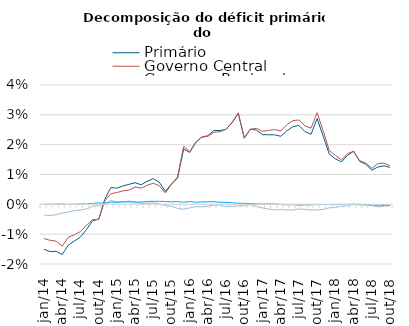
| Category | Primário | Governo Central | Governos Regionais | Empresas Estatais* |
|---|---|---|---|---|
| jan/14 | -0.015 | -0.011 | -0.004 | 0 |
| fev/14 | -0.016 | -0.012 | -0.004 | 0 |
| mar/14 | -0.016 | -0.012 | -0.003 | 0 |
| abr/14 | -0.017 | -0.014 | -0.003 | 0 |
| mai/14 | -0.014 | -0.011 | -0.003 | 0 |
| jun/14 | -0.012 | -0.01 | -0.002 | 0 |
| jul/14 | -0.011 | -0.009 | -0.002 | 0 |
| ago/14 | -0.008 | -0.007 | -0.002 | 0 |
| set/14 | -0.005 | -0.005 | -0.001 | 0 |
| out/14 | -0.005 | -0.005 | 0 | 0 |
| nov/14 | 0.002 | 0.001 | 0 | 0 |
| dez/14 | 0.006 | 0.004 | 0.001 | 0.001 |
| jan/15 | 0.005 | 0.004 | 0.001 | 0.001 |
| fev/15 | 0.006 | 0.005 | 0.001 | 0.001 |
| mar/15 | 0.007 | 0.005 | 0.001 | 0.001 |
| abr/15 | 0.007 | 0.006 | 0.001 | 0.001 |
| mai/15 | 0.007 | 0.005 | 0 | 0.001 |
| jun/15 | 0.008 | 0.006 | 0 | 0.001 |
| jul/15 | 0.009 | 0.007 | 0.001 | 0.001 |
| ago/15 | 0.007 | 0.006 | 0 | 0.001 |
| set/15 | 0.004 | 0.004 | 0 | 0.001 |
| out/15 | 0.007 | 0.007 | -0.001 | 0.001 |
| nov/15 | 0.009 | 0.009 | -0.001 | 0.001 |
| dez/15 | 0.019 | 0.019 | -0.002 | 0.001 |
| jan/16 | 0.017 | 0.018 | -0.001 | 0.001 |
| fev/16 | 0.021 | 0.021 | -0.001 | 0.001 |
| mar/16 | 0.023 | 0.023 | -0.001 | 0.001 |
| abr/16 | 0.023 | 0.023 | -0.001 | 0.001 |
| mai/16 | 0.025 | 0.024 | 0 | 0.001 |
| jun/16 | 0.025 | 0.024 | 0 | 0.001 |
| jul/16 | 0.025 | 0.025 | -0.001 | 0.001 |
| ago/16 | 0.027 | 0.028 | -0.001 | 0.001 |
| set/16 | 0.03 | 0.031 | -0.001 | 0 |
| out/16 | 0.022 | 0.022 | 0 | 0 |
| nov/16 | 0.025 | 0.025 | 0 | 0 |
| dez/16 | 0.025 | 0.025 | -0.001 | 0 |
| jan/17 | 0.023 | 0.024 | -0.001 | 0 |
| fev/17 | 0.023 | 0.025 | -0.002 | 0 |
| mar/17 | 0.023 | 0.025 | -0.002 | 0 |
| abr/17 | 0.023 | 0.025 | -0.002 | 0 |
| mai/17 | 0.025 | 0.027 | -0.002 | 0 |
| jun/17 | 0.026 | 0.028 | -0.002 | 0 |
| jul/17 | 0.026 | 0.028 | -0.002 | 0 |
| ago/17 | 0.024 | 0.026 | -0.002 | 0 |
| set/17 | 0.023 | 0.026 | -0.002 | 0 |
| out/17 | 0.029 | 0.031 | -0.002 | 0 |
| nov/17 | 0.023 | 0.025 | -0.002 | 0 |
| dez/17 | 0.017 | 0.018 | -0.001 | 0 |
| jan/18 | 0.015 | 0.016 | -0.001 | 0 |
| fev/18 | 0.014 | 0.015 | -0.001 | 0 |
| mar/18 | 0.016 | 0.017 | -0.001 | 0 |
| abr/18 | 0.018 | 0.018 | 0 | 0 |
| mai/18 | 0.014 | 0.015 | 0 | 0 |
| jun/18 | 0.013 | 0.014 | 0 | 0 |
| jul/18 | 0.011 | 0.012 | 0 | 0 |
| ago/18 | 0.012 | 0.014 | -0.001 | 0 |
| set/18 | 0.013 | 0.014 | -0.001 | 0 |
| out/18 | 0.012 | 0.013 | 0 | -0.001 |